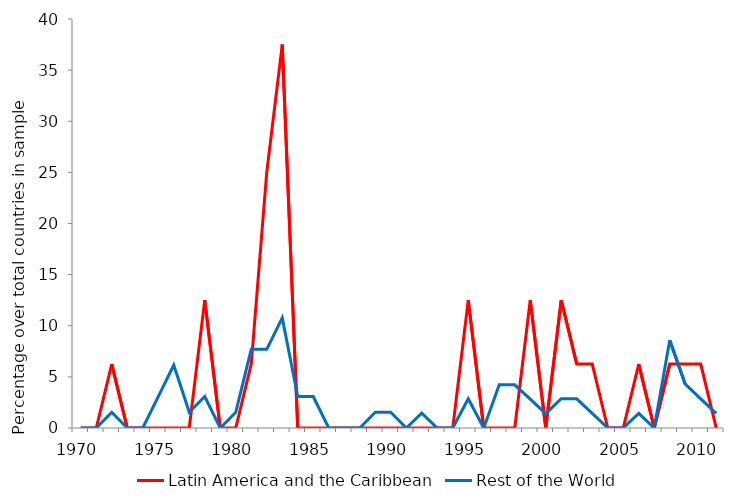
| Category | Latin America and the Caribbean | Rest of the World |
|---|---|---|
| 1970.0 | 0 | 0 |
| 1971.0 | 0 | 0 |
| 1972.0 | 6.25 | 1.538 |
| 1973.0 | 0 | 0 |
| 1974.0 | 0 | 0 |
| 1975.0 | 0 | 3.077 |
| 1976.0 | 0 | 6.154 |
| 1977.0 | 0 | 1.538 |
| 1978.0 | 12.5 | 3.077 |
| 1979.0 | 0 | 0 |
| 1980.0 | 0 | 1.538 |
| 1981.0 | 6.25 | 7.692 |
| 1982.0 | 25 | 7.692 |
| 1983.0 | 37.5 | 10.769 |
| 1984.0 | 0 | 3.077 |
| 1985.0 | 0 | 3.077 |
| 1986.0 | 0 | 0 |
| 1987.0 | 0 | 0 |
| 1988.0 | 0 | 0 |
| 1989.0 | 0 | 1.538 |
| 1990.0 | 0 | 1.538 |
| 1991.0 | 0 | 0 |
| 1992.0 | 0 | 1.449 |
| 1993.0 | 0 | 0 |
| 1994.0 | 0 | 0 |
| 1995.0 | 12.5 | 2.857 |
| 1996.0 | 0 | 0 |
| 1997.0 | 0 | 4.225 |
| 1998.0 | 0 | 4.225 |
| 1999.0 | 12.5 | 2.817 |
| 2000.0 | 0 | 1.408 |
| 2001.0 | 12.5 | 2.857 |
| 2002.0 | 6.25 | 2.857 |
| 2003.0 | 6.25 | 1.429 |
| 2004.0 | 0 | 0 |
| 2005.0 | 0 | 0 |
| 2006.0 | 6.25 | 1.429 |
| 2007.0 | 0 | 0 |
| 2008.0 | 6.25 | 8.571 |
| 2009.0 | 6.25 | 4.286 |
| 2010.0 | 6.25 | 2.857 |
| 2011.0 | 0 | 1.429 |